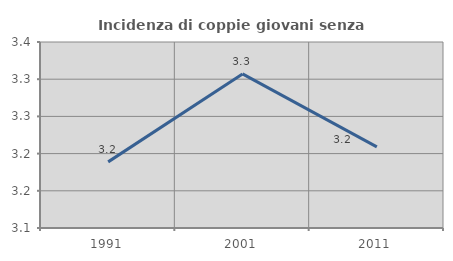
| Category | Incidenza di coppie giovani senza figli |
|---|---|
| 1991.0 | 3.189 |
| 2001.0 | 3.307 |
| 2011.0 | 3.209 |